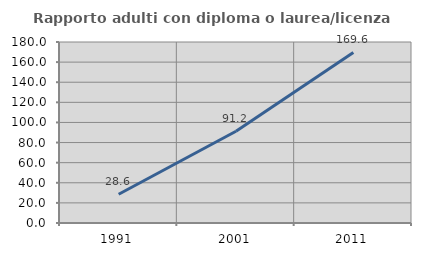
| Category | Rapporto adulti con diploma o laurea/licenza media  |
|---|---|
| 1991.0 | 28.571 |
| 2001.0 | 91.209 |
| 2011.0 | 169.62 |